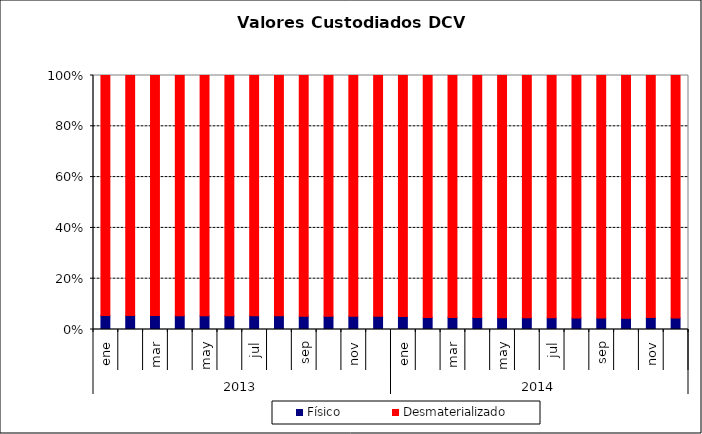
| Category | Físico | Desmaterializado |
|---|---|---|
| 0 | 369.968 | 6339.304 |
| 1 | 368.222 | 6302.701 |
| 2 | 365.243 | 6292.27 |
| 3 | 364.126 | 6381.05 |
| 4 | 362.85 | 6358.399 |
| 5 | 362.153 | 6275.895 |
| 6 | 357.445 | 6253.685 |
| 7 | 354.497 | 6198.341 |
| 8 | 349.045 | 6298.52 |
| 9 | 346.635 | 6288.351 |
| 10 | 341.656 | 6253.29 |
| 11 | 337.66 | 6141.51 |
| 12 | 332.362 | 6159.445 |
| 13 | 313.875 | 6280.813 |
| 14 | 312.507 | 6253.467 |
| 15 | 308.893 | 6286.819 |
| 16 | 307.987 | 6310.993 |
| 17 | 306.686 | 6272.814 |
| 18 | 304.818 | 6348.411 |
| 19 | 305.689 | 6423.945 |
| 20 | 303.086 | 6458.4 |
| 21 | 301.754 | 6476.745 |
| 22 | 323.647 | 6577.862 |
| 23 | 305.676 | 6445.378 |